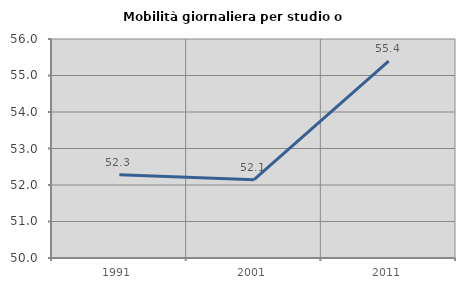
| Category | Mobilità giornaliera per studio o lavoro |
|---|---|
| 1991.0 | 52.281 |
| 2001.0 | 52.145 |
| 2011.0 | 55.397 |